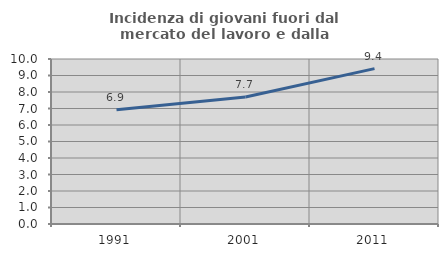
| Category | Incidenza di giovani fuori dal mercato del lavoro e dalla formazione  |
|---|---|
| 1991.0 | 6.917 |
| 2001.0 | 7.692 |
| 2011.0 | 9.416 |